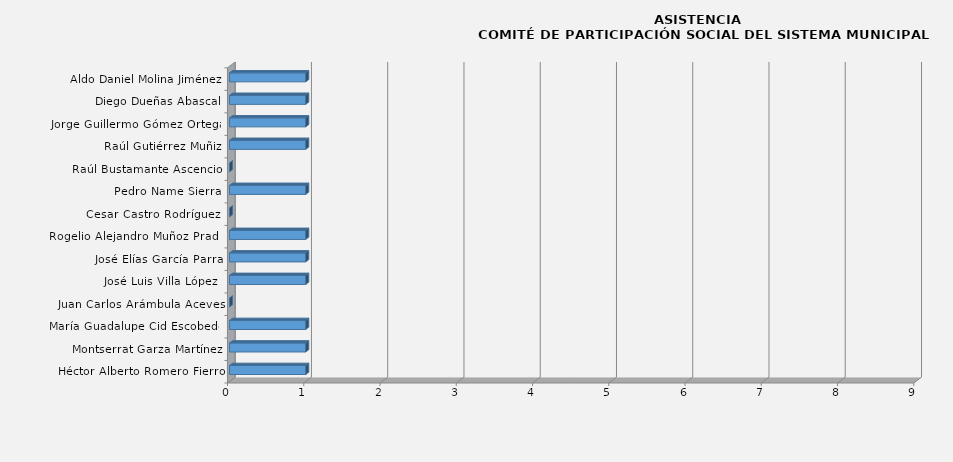
| Category | Series 0 |
|---|---|
| Héctor Alberto Romero Fierro | 1 |
| Montserrat Garza Martínez | 1 |
| María Guadalupe Cid Escobedo | 1 |
| Juan Carlos Arámbula Aceves | 0 |
| José Luis Villa López  | 1 |
| José Elías García Parra | 1 |
| Rogelio Alejandro Muñoz Prado | 1 |
| Cesar Castro Rodríguez  | 0 |
| Pedro Name Sierra | 1 |
| Raúl Bustamante Ascencio | 0 |
| Raúl Gutiérrez Muñiz | 1 |
| Jorge Guillermo Gómez Ortega | 1 |
| Diego Dueñas Abascal | 1 |
| Aldo Daniel Molina Jiménez | 1 |